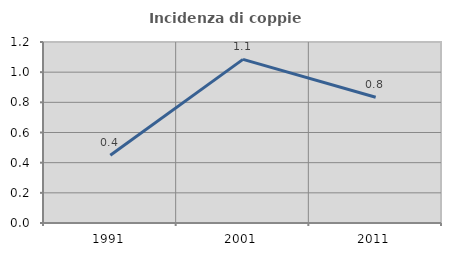
| Category | Incidenza di coppie miste |
|---|---|
| 1991.0 | 0.45 |
| 2001.0 | 1.085 |
| 2011.0 | 0.833 |